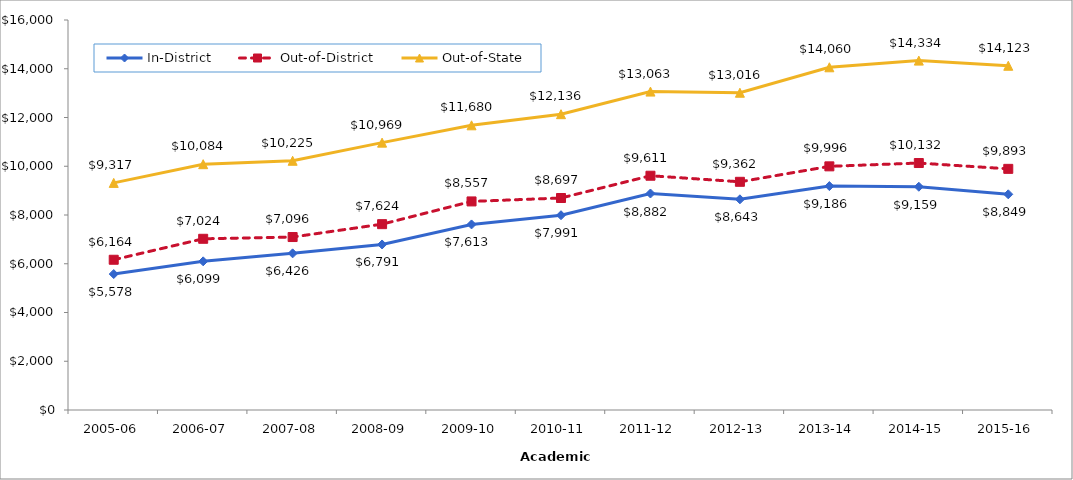
| Category | In-District | Out-of-District | Out-of-State |
|---|---|---|---|
| 2005-06 | 5578 | 6164 | 9317 |
| 2006-07 | 6099 | 7024 | 10084 |
| 2007-08 | 6426 | 7096 | 10225 |
| 2008-09 | 6791 | 7624 | 10969 |
| 2009-10 | 7613 | 8557 | 11680 |
| 2010-11 | 7991 | 8697 | 12136 |
| 2011-12 | 8882 | 9611 | 13063 |
| 2012-13 | 8643.15 | 9362 | 13016 |
| 2013-14 | 9185.83 | 9996.06 | 14060.13 |
| 2014-15 | 9159.04 | 10132.13 | 14333.65 |
| 2015-16 | 8849 | 9893 | 14123 |